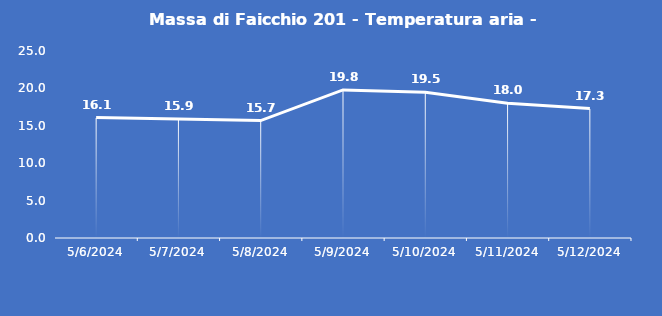
| Category | Massa di Faicchio 201 - Temperatura aria - Grezzo (°C) |
|---|---|
| 5/6/24 | 16.1 |
| 5/7/24 | 15.9 |
| 5/8/24 | 15.7 |
| 5/9/24 | 19.8 |
| 5/10/24 | 19.5 |
| 5/11/24 | 18 |
| 5/12/24 | 17.3 |